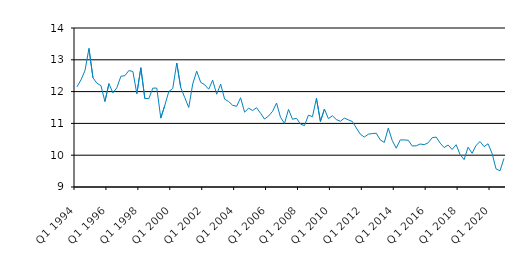
| Category | Series 0 |
|---|---|
| Q1 1994 | 12.15 |
| Q2 1994 | 12.369 |
| Q3 1994 | 12.659 |
| Q4 1994 | 13.357 |
| Q1 1995 | 12.435 |
| Q2 1995 | 12.262 |
| Q3 1995 | 12.188 |
| Q4 1995 | 11.688 |
| Q1 1996 | 12.25 |
| Q2 1996 | 11.958 |
| Q3 1996 | 12.125 |
| Q4 1996 | 12.483 |
| Q1 1997 | 12.5 |
| Q2 1997 | 12.662 |
| Q3 1997 | 12.633 |
| Q4 1997 | 11.933 |
| Q1 1998 | 12.75 |
| Q2 1998 | 11.781 |
| Q3 1998 | 11.781 |
| Q4 1998 | 12.11 |
| Q1 1999 | 12.11 |
| Q2 1999 | 11.166 |
| Q3 1999 | 11.566 |
| Q4 1999 | 12 |
| Q1 2000 | 12.1 |
| Q2 2000 | 12.899 |
| Q3 2000 | 12.125 |
| Q4 2000 | 11.812 |
| Q1 2001 | 11.5 |
| Q2 2001 | 12.241 |
| Q3 2001 | 12.642 |
| Q4 2001 | 12.291 |
| Q1 2002 | 12.215 |
| Q2 2002 | 12.075 |
| Q3 2002 | 12.36 |
| Q4 2002 | 11.917 |
| Q1 2003 | 12.236 |
| Q2 2003 | 11.761 |
| Q3 2003 | 11.688 |
| Q4 2003 | 11.569 |
| Q1 2004 | 11.539 |
| Q2 2004 | 11.807 |
| Q3 2004 | 11.354 |
| Q4 2004 | 11.477 |
| Q1 2005 | 11.406 |
| Q2 2005 | 11.493 |
| Q3 2005 | 11.318 |
| Q4 2005 | 11.136 |
| Q1 2006 | 11.231 |
| Q2 2006 | 11.38 |
| Q3 2006 | 11.64 |
| Q4 2006 | 11.19 |
| Q1 2007 | 11 |
| Q2 2007 | 11.44 |
| Q3 2007 | 11.13 |
| Q4 2007 | 11.16 |
| Q1 2008 | 10.98 |
| Q2 2008 | 10.93 |
| Q3 2008 | 11.26 |
| Q4 2008 | 11.21 |
| Q1 2009 | 11.79 |
| Q2 2009 | 11.06 |
| Q3 2009 | 11.45 |
| Q4 2009 | 11.15 |
| Q1 2010 | 11.24 |
| Q2 2010 | 11.12 |
| Q3 2010 | 11.067 |
| Q4 2010 | 11.166 |
| Q1 2011 | 11.11 |
| Q2 2011 | 11.06 |
| Q3 2011 | 10.855 |
| Q4 2011 | 10.66 |
| Q1 2012 | 10.57 |
| Q2 2012 | 10.66 |
| Q3 2012 | 10.68 |
| Q4 2012 | 10.69 |
| Q1 2013 | 10.48 |
| Q2 2013 | 10.4 |
| Q3 2013 | 10.85 |
| Q4 2013 | 10.46 |
| Q1 2014 | 10.22 |
| Q2 2014 | 10.479 |
| Q3 2014 | 10.48 |
| Q4 2014 | 10.47 |
| Q1 2015 | 10.29 |
| Q2 2015 | 10.295 |
| Q3 2015 | 10.352 |
| Q4 2015 | 10.33 |
| Q1 2016 | 10.39 |
| Q2 2016 | 10.55 |
| Q3 2016 | 10.57 |
| Q4 2016 | 10.38 |
| Q1 2017 | 10.24 |
| Q2 2017 | 10.32 |
| Q3 2017 | 10.18 |
| Q4 2017 | 10.33 |
| Q1 2018 | 10.02 |
| Q2 2018 | 9.86 |
| Q3 2018 | 10.251 |
| Q4 2018 | 10.06 |
| Q1 2019 | 10.308 |
| Q2 2019 | 10.429 |
| Q3 2019 | 10.27 |
| Q4 2019 | 10.36 |
| Q1 2020 | 10.06 |
| Q2 2020 | 9.57 |
| Q3 2020 | 9.51 |
| Q4 2020 | 9.9 |